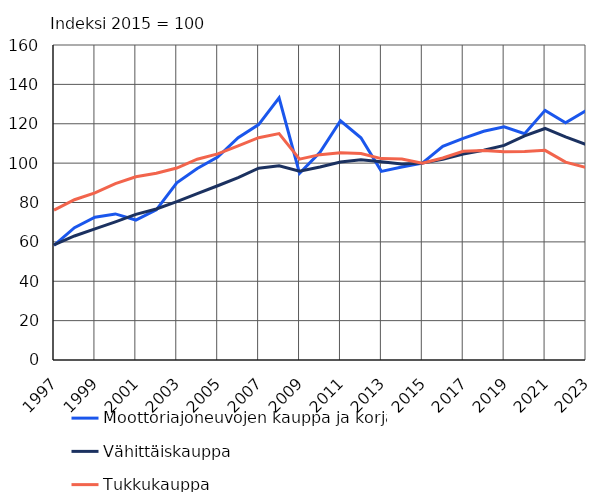
| Category | Moottoriajoneuvojen kauppa ja korjaus | Vähittäiskauppa | Tukkukauppa |
|---|---|---|---|
| 1997.0 | 58.2 | 58.5 | 76.1 |
| 1998.0 | 67.2 | 63 | 81.4 |
| 1999.0 | 72.5 | 66.6 | 84.9 |
| 2000.0 | 74.2 | 70.2 | 89.6 |
| 2001.0 | 71.1 | 74 | 93.1 |
| 2002.0 | 76.3 | 76.7 | 94.9 |
| 2003.0 | 90 | 80.4 | 97.5 |
| 2004.0 | 97.3 | 84.5 | 102 |
| 2005.0 | 103.1 | 88.5 | 104.7 |
| 2006.0 | 112.9 | 92.6 | 108.8 |
| 2007.0 | 119.6 | 97.4 | 112.9 |
| 2008.0 | 133.2 | 98.6 | 115 |
| 2009.0 | 94.8 | 95.9 | 102 |
| 2010.0 | 105.5 | 98 | 104.3 |
| 2011.0 | 121.5 | 100.6 | 105.3 |
| 2012.0 | 112.9 | 101.7 | 104.9 |
| 2013.0 | 95.8 | 100.7 | 102.3 |
| 2014.0 | 98 | 99.5 | 102.1 |
| 2015.0 | 100 | 100 | 100 |
| 2016.0 | 108.5 | 102 | 102.6 |
| 2017.0 | 112.6 | 104.6 | 106 |
| 2018.0 | 116.2 | 106.5 | 106.4 |
| 2019.0 | 118.4 | 109 | 105.8 |
| 2020.0 | 114.9 | 113.8 | 105.9 |
| 2021.0 | 126.8 | 117.6 | 106.5 |
| 2022.0 | 120.5 | 113.3 | 100.5 |
| 2023.0 | 126.7 | 109.5 | 97.8 |